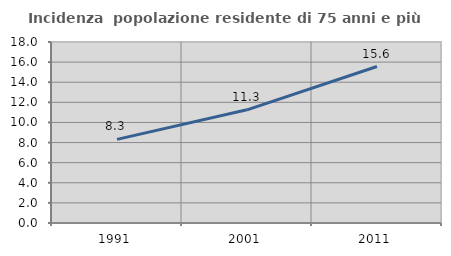
| Category | Incidenza  popolazione residente di 75 anni e più |
|---|---|
| 1991.0 | 8.318 |
| 2001.0 | 11.256 |
| 2011.0 | 15.562 |